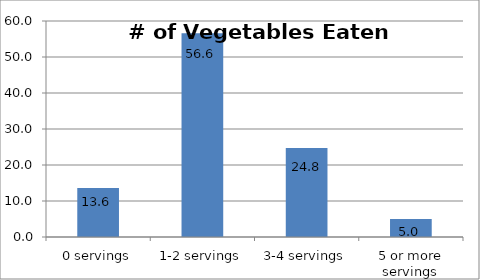
| Category | Series 0 |
|---|---|
| 0 servings | 13.637 |
| 1-2 servings | 56.588 |
| 3-4 servings | 24.755 |
| 5 or more servings | 5.021 |